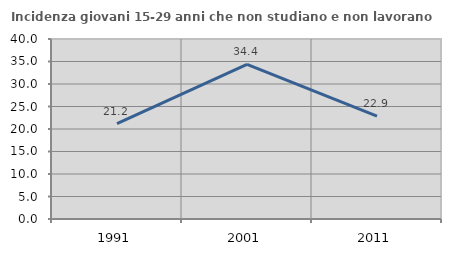
| Category | Incidenza giovani 15-29 anni che non studiano e non lavorano  |
|---|---|
| 1991.0 | 21.17 |
| 2001.0 | 34.375 |
| 2011.0 | 22.857 |